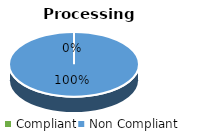
| Category | Series 1 | Series 0 |
|---|---|---|
| Compliant | 0 | 0 |
| Non Compliant | 9 | 10 |